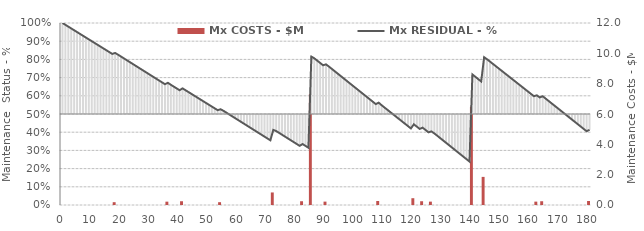
| Category | Mx COSTS - $M |
|---|---|
| 0 | 0 |
| 1 | 0 |
| 2 | 0 |
| 3 | 0 |
| 4 | 0 |
| 5 | 0 |
| 6 | 0 |
| 7 | 0 |
| 8 | 0 |
| 9 | 0 |
| 10 | 0 |
| 11 | 0 |
| 12 | 0 |
| 13 | 0 |
| 14 | 0 |
| 15 | 0 |
| 16 | 0 |
| 17 | 0 |
| 18 | 185400 |
| 19 | 0 |
| 20 | 0 |
| 21 | 0 |
| 22 | 0 |
| 23 | 0 |
| 24 | 0 |
| 25 | 0 |
| 26 | 0 |
| 27 | 0 |
| 28 | 0 |
| 29 | 0 |
| 30 | 0 |
| 31 | 0 |
| 32 | 0 |
| 33 | 0 |
| 34 | 0 |
| 35 | 0 |
| 36 | 220400 |
| 37 | 0 |
| 38 | 0 |
| 39 | 0 |
| 40 | 0 |
| 41 | 248100 |
| 42 | 0 |
| 43 | 0 |
| 44 | 0 |
| 45 | 0 |
| 46 | 0 |
| 47 | 0 |
| 48 | 0 |
| 49 | 0 |
| 50 | 0 |
| 51 | 0 |
| 52 | 0 |
| 53 | 0 |
| 54 | 185400 |
| 55 | 0 |
| 56 | 0 |
| 57 | 0 |
| 58 | 0 |
| 59 | 0 |
| 60 | 0 |
| 61 | 0 |
| 62 | 0 |
| 63 | 0 |
| 64 | 0 |
| 65 | 0 |
| 66 | 0 |
| 67 | 0 |
| 68 | 0 |
| 69 | 0 |
| 70 | 0 |
| 71 | 0 |
| 72 | 827090 |
| 73 | 0 |
| 74 | 0 |
| 75 | 0 |
| 76 | 0 |
| 77 | 0 |
| 78 | 0 |
| 79 | 0 |
| 80 | 0 |
| 81 | 0 |
| 82 | 248100 |
| 83 | 0 |
| 84 | 0 |
| 85 | 7307280 |
| 86 | 0 |
| 87 | 0 |
| 88 | 0 |
| 89 | 0 |
| 90 | 222480 |
| 91 | 0 |
| 92 | 0 |
| 93 | 0 |
| 94 | 0 |
| 95 | 0 |
| 96 | 0 |
| 97 | 0 |
| 98 | 0 |
| 99 | 0 |
| 100 | 0 |
| 101 | 0 |
| 102 | 0 |
| 103 | 0 |
| 104 | 0 |
| 105 | 0 |
| 106 | 0 |
| 107 | 0 |
| 108 | 264480 |
| 109 | 0 |
| 110 | 0 |
| 111 | 0 |
| 112 | 0 |
| 113 | 0 |
| 114 | 0 |
| 115 | 0 |
| 116 | 0 |
| 117 | 0 |
| 118 | 0 |
| 119 | 0 |
| 120 | 448050 |
| 121 | 0 |
| 122 | 0 |
| 123 | 248100 |
| 124 | 0 |
| 125 | 0 |
| 126 | 222480 |
| 127 | 0 |
| 128 | 0 |
| 129 | 0 |
| 130 | 0 |
| 131 | 0 |
| 132 | 0 |
| 133 | 0 |
| 134 | 0 |
| 135 | 0 |
| 136 | 0 |
| 137 | 0 |
| 138 | 0 |
| 139 | 0 |
| 140 | 6481755 |
| 141 | 0 |
| 142 | 0 |
| 143 | 0 |
| 144 | 1853433.5 |
| 145 | 0 |
| 146 | 0 |
| 147 | 0 |
| 148 | 0 |
| 149 | 0 |
| 150 | 0 |
| 151 | 0 |
| 152 | 0 |
| 153 | 0 |
| 154 | 0 |
| 155 | 0 |
| 156 | 0 |
| 157 | 0 |
| 158 | 0 |
| 159 | 0 |
| 160 | 0 |
| 161 | 0 |
| 162 | 222480 |
| 163 | 0 |
| 164 | 248100 |
| 165 | 0 |
| 166 | 0 |
| 167 | 0 |
| 168 | 0 |
| 169 | 0 |
| 170 | 0 |
| 171 | 0 |
| 172 | 0 |
| 173 | 0 |
| 174 | 0 |
| 175 | 0 |
| 176 | 0 |
| 177 | 0 |
| 178 | 0 |
| 179 | 0 |
| 180 | 264480 |